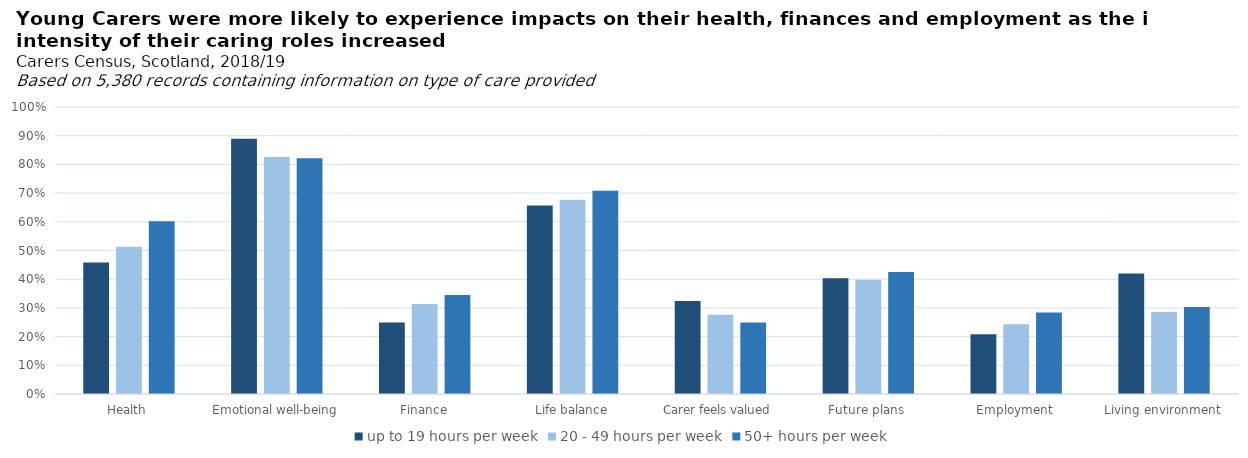
| Category | up to 19 hours per week | 20 - 49 hours per week | 50+ hours per week |
|---|---|---|---|
| Health | 0.458 | 0.513 | 0.602 |
| Emotional well-being | 0.889 | 0.826 | 0.821 |
| Finance | 0.249 | 0.314 | 0.345 |
| Life balance | 0.657 | 0.677 | 0.708 |
| Carer feels valued | 0.324 | 0.276 | 0.249 |
| Future plans | 0.403 | 0.398 | 0.425 |
| Employment | 0.208 | 0.243 | 0.284 |
| Living environment | 0.42 | 0.286 | 0.303 |